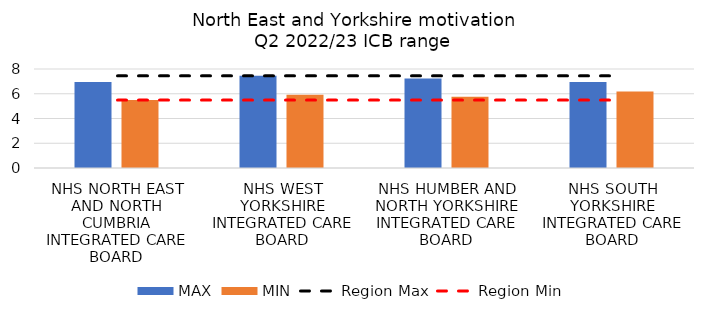
| Category | MAX | MIN |
|---|---|---|
| NHS NORTH EAST AND NORTH CUMBRIA INTEGRATED CARE BOARD | 6.946 | 5.485 |
| NHS WEST YORKSHIRE INTEGRATED CARE BOARD | 7.446 | 5.928 |
| NHS HUMBER AND NORTH YORKSHIRE INTEGRATED CARE BOARD | 7.227 | 5.753 |
| NHS SOUTH YORKSHIRE INTEGRATED CARE BOARD | 6.942 | 6.189 |